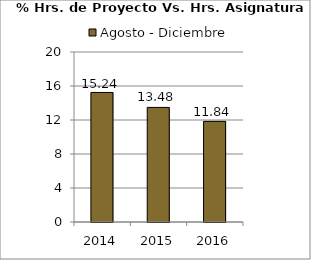
| Category | Agosto - Diciembre |
|---|---|
| 2014.0 | 15.24 |
| 2015.0 | 13.48 |
| 2016.0 | 11.84 |